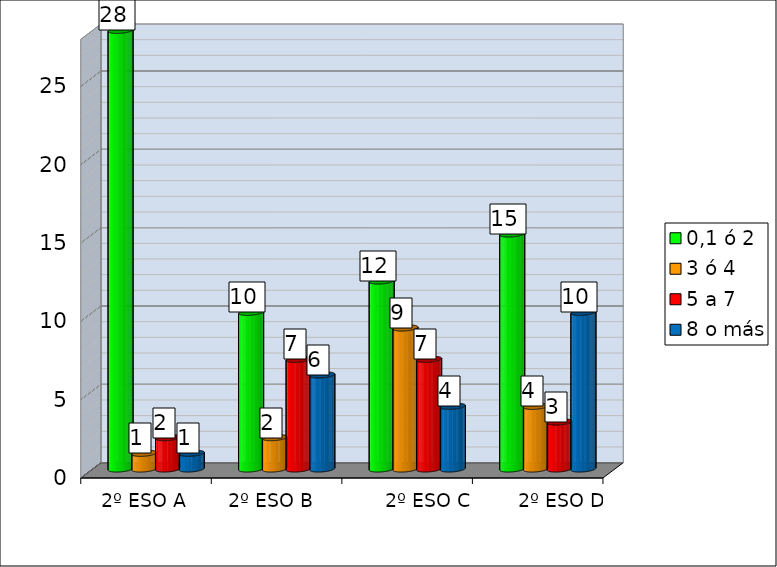
| Category | 0,1 ó 2  | 3 ó 4 | 5 a 7 | 8 o más |
|---|---|---|---|---|
|  | 28 | 1 | 2 | 1 |
|  | 10 | 2 | 7 | 6 |
|  | 12 | 9 | 7 | 4 |
|  | 15 | 4 | 3 | 10 |